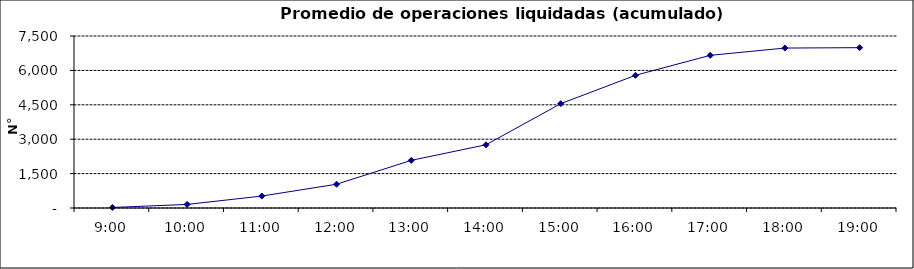
| Category | Promedio Op.Liquidadas (acumulado) |
|---|---|
| 0.375 | 22.579 |
| 0.4166666666666667 | 155.789 |
| 0.4583333333333333 | 521 |
| 0.5 | 1036 |
| 0.5416666666666666 | 2077.737 |
| 0.5833333333333334 | 2756.579 |
| 0.625 | 4548.579 |
| 0.6666666666666666 | 5786.316 |
| 0.7083333333333334 | 6657.105 |
| 0.75 | 6974.632 |
| 0.7916666666666666 | 6991.474 |